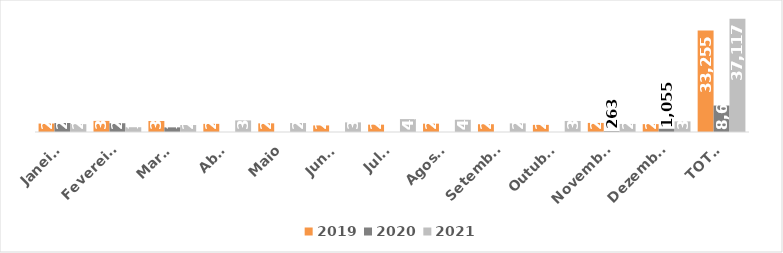
| Category | 2019 | 2020 | 2021 |
|---|---|---|---|
| Janeiro | 2767 | 2960 | 2569 |
| Fevereiro | 3638 | 2874 | 1563 |
| Março | 3612 | 1522 | 2283 |
| Abril | 2666 | 0 | 3799 |
| Maio | 2835 | 0 | 2933 |
| Junho | 2154 | 0 | 3153 |
| Julho | 2405 | 0 | 4231 |
| Agosto | 2725 | 0 | 4013 |
| Setembro | 2548 | 0 | 2828 |
| Outubro | 2341 | 0 | 3622 |
| Novembro | 2980 | 263 | 2642 |
| Dezembro | 2584 | 1055 | 3481 |